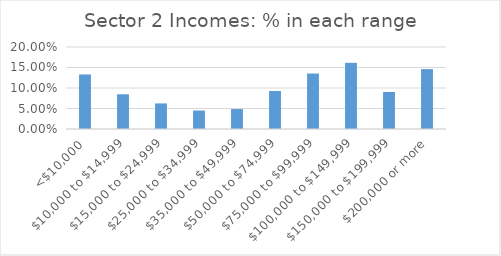
| Category | Series 0 |
|---|---|
| <$10,000 | 0.133 |
| $10,000 to $14,999 | 0.085 |
| $15,000 to $24,999 | 0.062 |
| $25,000 to $34,999 | 0.045 |
| $35,000 to $49,999 | 0.049 |
| $50,000 to $74,999 | 0.093 |
| $75,000 to $99,999 | 0.135 |
| $100,000 to $149,999 | 0.161 |
| $150,000 to $199,999 | 0.09 |
| $200,000 or more | 0.146 |